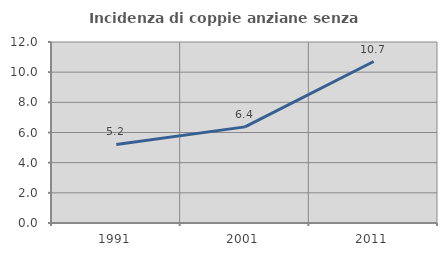
| Category | Incidenza di coppie anziane senza figli  |
|---|---|
| 1991.0 | 5.205 |
| 2001.0 | 6.373 |
| 2011.0 | 10.706 |